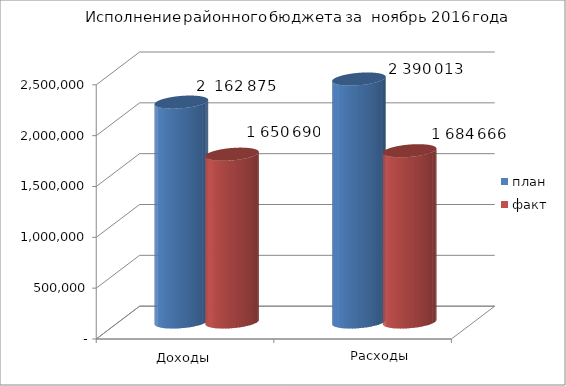
| Category | план | факт |
|---|---|---|
| 0 | 2162875 | 1650690 |
| 1 | 2390013 | 1684666 |